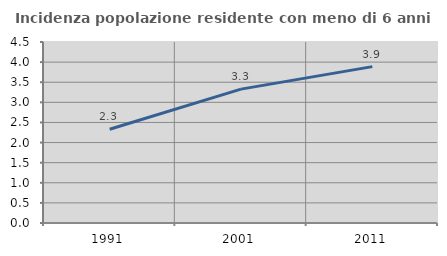
| Category | Incidenza popolazione residente con meno di 6 anni |
|---|---|
| 1991.0 | 2.332 |
| 2001.0 | 3.328 |
| 2011.0 | 3.888 |